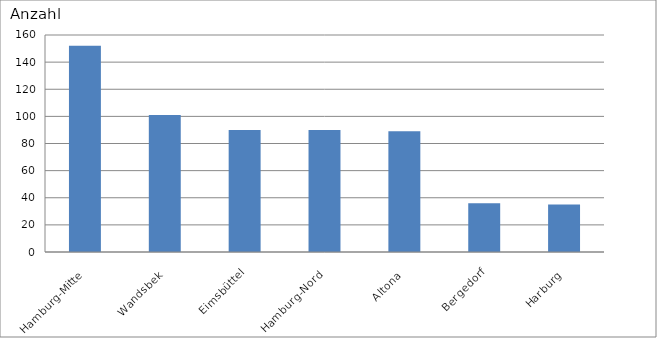
| Category | Hamburg-Mitte |
|---|---|
| Hamburg-Mitte | 152 |
| Wandsbek | 101 |
| Eimsbüttel | 90 |
| Hamburg-Nord | 90 |
| Altona | 89 |
| Bergedorf | 36 |
| Harburg | 35 |